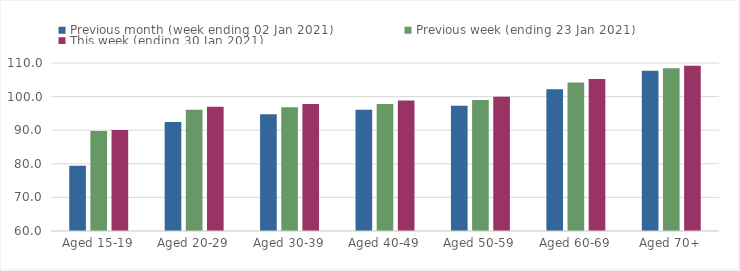
| Category | Previous month (week ending 02 Jan 2021) | Previous week (ending 23 Jan 2021) | This week (ending 30 Jan 2021) |
|---|---|---|---|
| Aged 15-19 | 79.39 | 89.79 | 90.05 |
| Aged 20-29 | 92.42 | 96.12 | 96.95 |
| Aged 30-39 | 94.76 | 96.8 | 97.79 |
| Aged 40-49 | 96.12 | 97.81 | 98.82 |
| Aged 50-59 | 97.24 | 98.96 | 99.96 |
| Aged 60-69 | 102.19 | 104.17 | 105.27 |
| Aged 70+ | 107.72 | 108.46 | 109.16 |